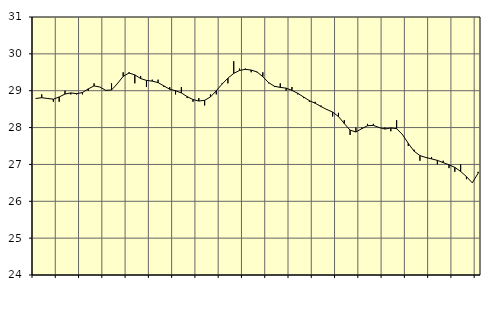
| Category | Piggar | Series 1 |
|---|---|---|
| nan | 28.8 | 28.79 |
| 1.0 | 28.9 | 28.81 |
| 1.0 | 28.8 | 28.79 |
| 1.0 | 28.7 | 28.77 |
| nan | 28.7 | 28.83 |
| 2.0 | 29 | 28.91 |
| 2.0 | 28.9 | 28.94 |
| 2.0 | 28.9 | 28.92 |
| nan | 28.9 | 28.95 |
| 3.0 | 29 | 29.05 |
| 3.0 | 29.2 | 29.13 |
| 3.0 | 29.1 | 29.1 |
| nan | 29 | 29.01 |
| 4.0 | 29.2 | 29.02 |
| 4.0 | 29.2 | 29.19 |
| 4.0 | 29.5 | 29.39 |
| nan | 29.5 | 29.48 |
| 5.0 | 29.2 | 29.43 |
| 5.0 | 29.4 | 29.33 |
| 5.0 | 29.1 | 29.28 |
| nan | 29.3 | 29.26 |
| 6.0 | 29.3 | 29.22 |
| 6.0 | 29.1 | 29.13 |
| 6.0 | 29.1 | 29.04 |
| nan | 28.9 | 29 |
| 7.0 | 29.1 | 28.94 |
| 7.0 | 28.8 | 28.84 |
| 7.0 | 28.7 | 28.76 |
| nan | 28.8 | 28.72 |
| 8.0 | 28.6 | 28.74 |
| 8.0 | 28.9 | 28.83 |
| 8.0 | 28.9 | 29 |
| nan | 29.2 | 29.18 |
| 9.0 | 29.2 | 29.34 |
| 9.0 | 29.8 | 29.47 |
| 9.0 | 29.6 | 29.55 |
| nan | 29.6 | 29.58 |
| 10.0 | 29.5 | 29.56 |
| 10.0 | 29.5 | 29.51 |
| 10.0 | 29.5 | 29.38 |
| nan | 29.2 | 29.22 |
| 11.0 | 29.1 | 29.12 |
| 11.0 | 29.2 | 29.09 |
| 11.0 | 29 | 29.07 |
| nan | 29.1 | 29.01 |
| 12.0 | 28.9 | 28.93 |
| 12.0 | 28.8 | 28.83 |
| 12.0 | 28.7 | 28.73 |
| nan | 28.7 | 28.66 |
| 13.0 | 28.6 | 28.57 |
| 13.0 | 28.5 | 28.49 |
| 13.0 | 28.3 | 28.42 |
| nan | 28.4 | 28.3 |
| 14.0 | 28.2 | 28.11 |
| 14.0 | 27.8 | 27.93 |
| 14.0 | 28 | 27.88 |
| nan | 28 | 27.97 |
| 15.0 | 28.1 | 28.05 |
| 15.0 | 28.1 | 28.06 |
| 15.0 | 28 | 28 |
| nan | 28 | 27.96 |
| 16.0 | 27.9 | 27.99 |
| 16.0 | 28.2 | 27.97 |
| 16.0 | 27.8 | 27.81 |
| nan | 27.5 | 27.57 |
| 17.0 | 27.4 | 27.36 |
| 17.0 | 27.1 | 27.24 |
| 17.0 | 27.2 | 27.19 |
| nan | 27.2 | 27.15 |
| 18.0 | 27 | 27.11 |
| 18.0 | 27.1 | 27.05 |
| 18.0 | 26.9 | 26.99 |
| nan | 26.8 | 26.92 |
| 19.0 | 27 | 26.81 |
| 19.0 | 26.6 | 26.67 |
| 19.0 | 26.5 | 26.5 |
| nan | 26.8 | 26.76 |